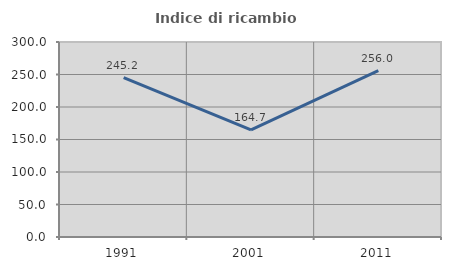
| Category | Indice di ricambio occupazionale  |
|---|---|
| 1991.0 | 245.205 |
| 2001.0 | 164.74 |
| 2011.0 | 256.034 |